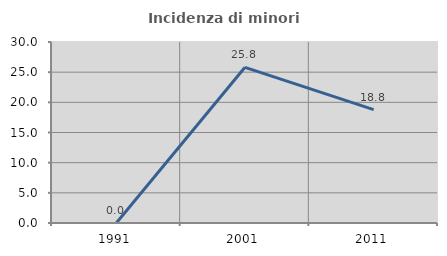
| Category | Incidenza di minori stranieri |
|---|---|
| 1991.0 | 0 |
| 2001.0 | 25.806 |
| 2011.0 | 18.788 |